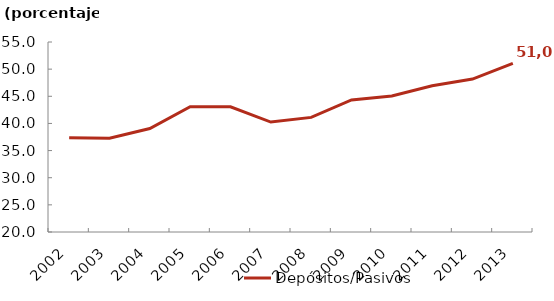
| Category | Depósitos/Pasivos |
|---|---|
| 2002.0 | 37.358 |
| 2003.0 | 37.259 |
| 2004.0 | 39.061 |
| 2005.0 | 43.069 |
| 2006.0 | 43.063 |
| 2007.0 | 40.249 |
| 2008.0 | 41.109 |
| 2009.0 | 44.325 |
| 2010.0 | 45.053 |
| 2011.0 | 46.945 |
| 2012.0 | 48.178 |
| 2013.0 | 51.048 |